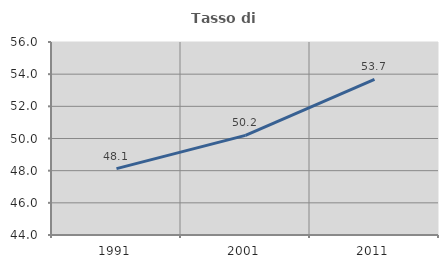
| Category | Tasso di occupazione   |
|---|---|
| 1991.0 | 48.129 |
| 2001.0 | 50.192 |
| 2011.0 | 53.673 |